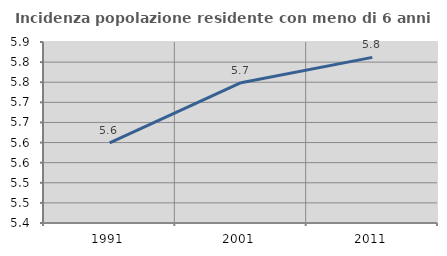
| Category | Incidenza popolazione residente con meno di 6 anni |
|---|---|
| 1991.0 | 5.599 |
| 2001.0 | 5.749 |
| 2011.0 | 5.812 |